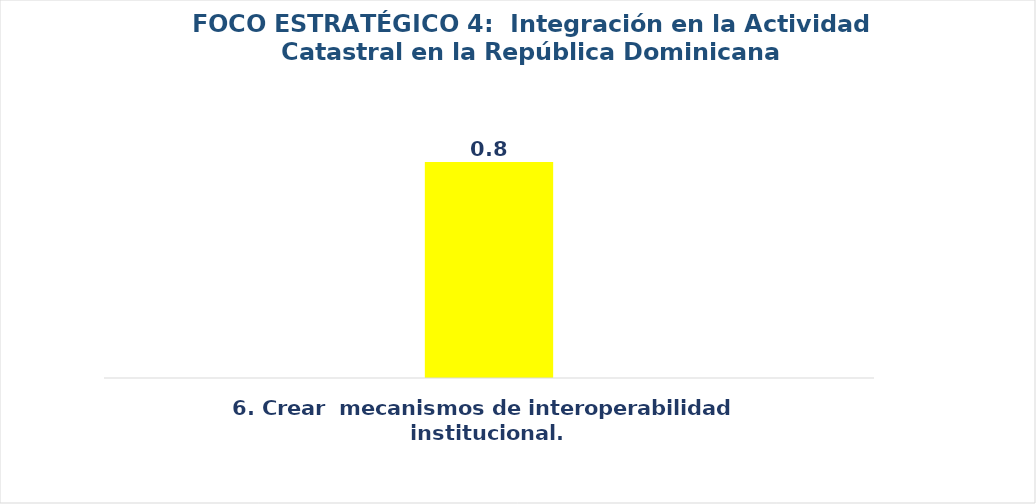
| Category | Series 0 |
|---|---|
| 6. Crear  mecanismos de interoperabilidad institucional.
 | 0.8 |